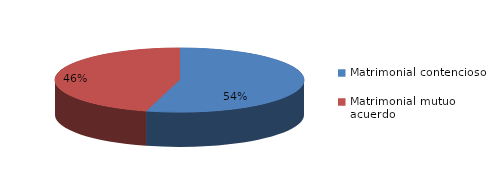
| Category | Series 0 |
|---|---|
| 0 | 829 |
| 1 | 698 |